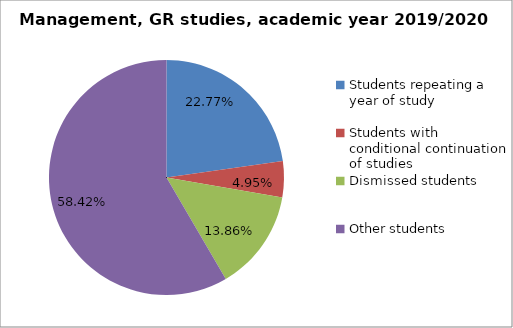
| Category | Series 0 |
|---|---|
| Students repeating a year of study | 23 |
| Students with conditional continuation of studies | 5 |
| Dismissed students | 14 |
| Other students | 59 |